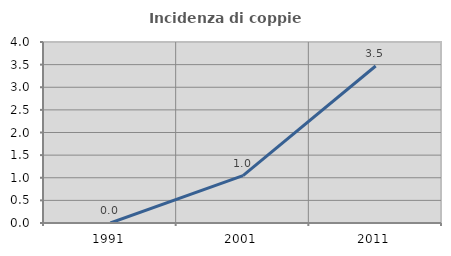
| Category | Incidenza di coppie miste |
|---|---|
| 1991.0 | 0 |
| 2001.0 | 1.045 |
| 2011.0 | 3.47 |